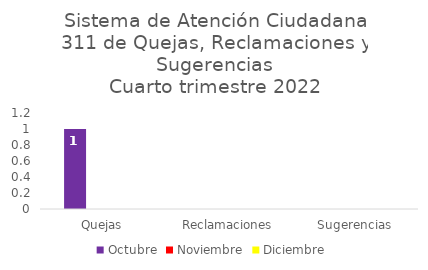
| Category | Octubre | Noviembre | Diciembre |
|---|---|---|---|
| Quejas | 1 | 0 | 0 |
| Reclamaciones | 0 | 0 | 0 |
| Sugerencias | 0 | 0 | 0 |